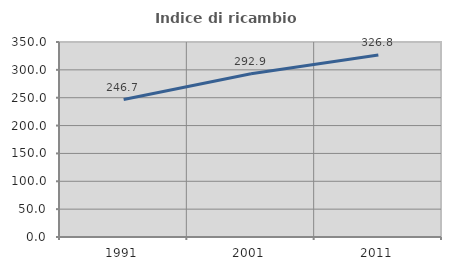
| Category | Indice di ricambio occupazionale  |
|---|---|
| 1991.0 | 246.701 |
| 2001.0 | 292.857 |
| 2011.0 | 326.816 |